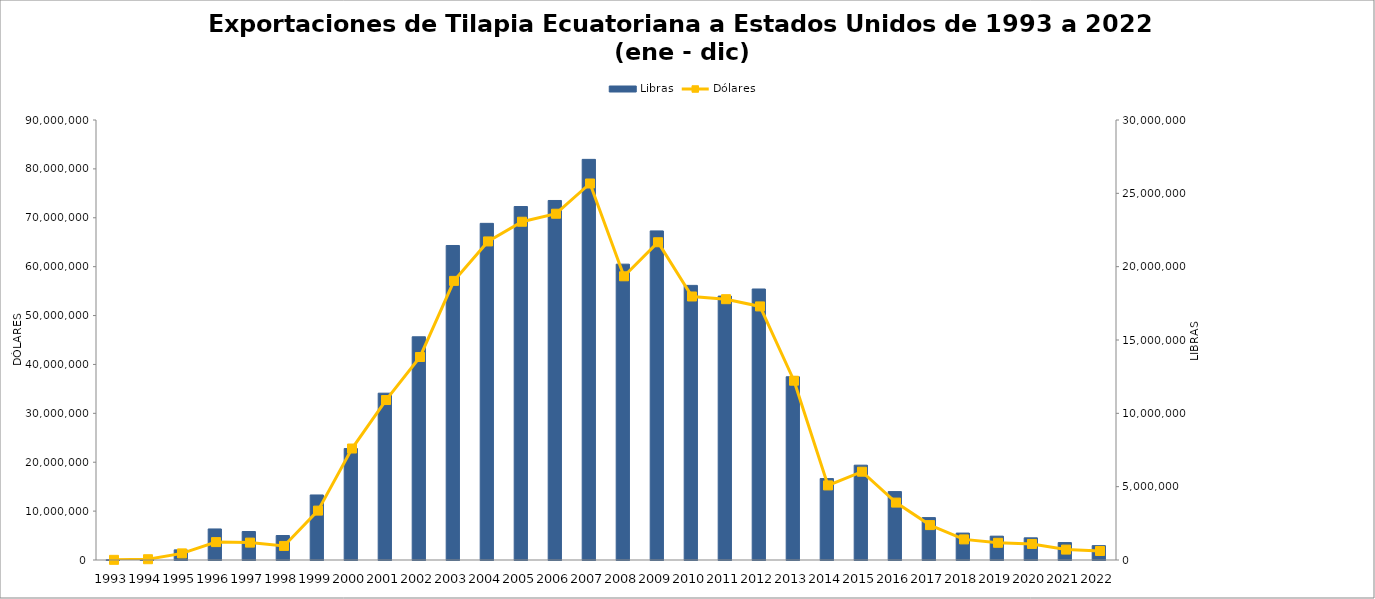
| Category | Libras |
|---|---|
| 1993.0 | 21730.742 |
| 1994.0 | 88499.258 |
| 1995.0 | 689457.786 |
| 1996.0 | 2116647.483 |
| 1997.0 | 1941708.064 |
| 1998.0 | 1668547.101 |
| 1999.0 | 4434656.516 |
| 2000.0 | 7599686.097 |
| 2001.0 | 11373890.75 |
| 2002.0 | 15219326.029 |
| 2003.0 | 21443302.043 |
| 2004.0 | 22953708.776 |
| 2005.0 | 24101028.913 |
| 2006.0 | 24512713.712 |
| 2007.0 | 27315395.237 |
| 2008.0 | 20170218.295 |
| 2009.0 | 22438586.35 |
| 2010.0 | 18724421.773 |
| 2011.0 | 17995543.535 |
| 2012.0 | 18477544.051 |
| 2013.0 | 12494087.693 |
| 2014.0 | 5552509.969 |
| 2015.0 | 6465454.516 |
| 2016.0 | 4663040.341 |
| 2017.0 | 2890376.104 |
| 2018.0 | 1835189.622 |
| 2019.0 | 1624659.435 |
| 2020.0 | 1511950.442 |
| 2021.0 | 1187904.372 |
| 2022.0 | 979320.864 |